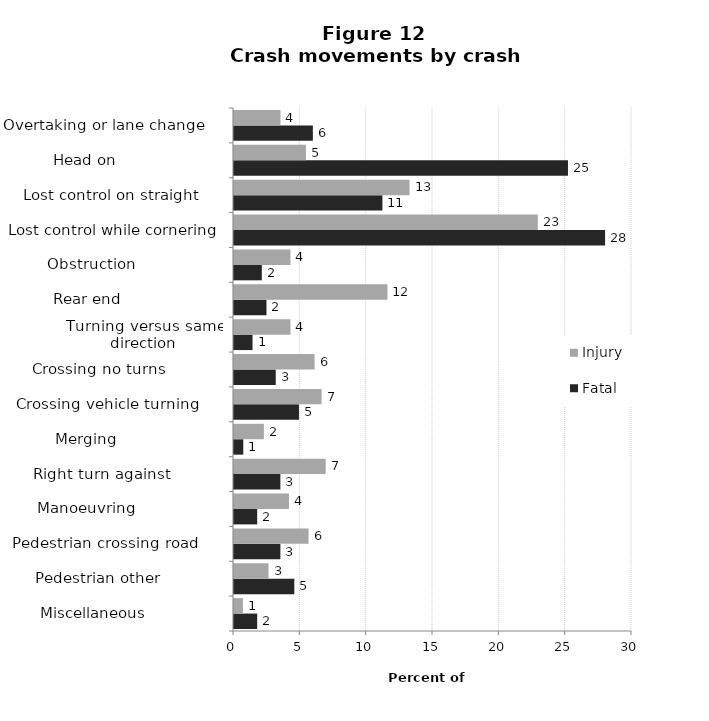
| Category | Fatal | Injury |
|---|---|---|
| Miscellaneous                 | 1.748 | 0.671 |
| Pedestrian other              | 4.545 | 2.603 |
| Pedestrian crossing road      | 3.497 | 5.619 |
| Manoeuvring                   | 1.748 | 4.142 |
| Right turn against            | 3.497 | 6.91 |
| Merging                       | 0.699 | 2.252 |
| Crossing vehicle turning      | 4.895 | 6.6 |
| Crossing no turns             | 3.147 | 6.073 |
| Turning versus same direction | 1.399 | 4.255 |
| Rear end                      | 2.448 | 11.568 |
| Obstruction                   | 2.098 | 4.255 |
| Lost control while cornering  | 27.972 | 22.898 |
| Lost control on straight      | 11.189 | 13.231 |
| Head on                       | 25.175 | 5.422 |
| Overtaking or lane change     | 5.944 | 3.501 |